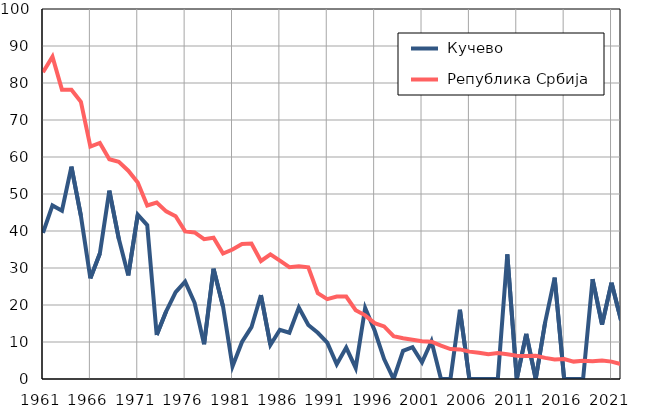
| Category |  Кучево |  Република Србија |
|---|---|---|
| 1961.0 | 39.5 | 82.9 |
| 1962.0 | 46.9 | 87.1 |
| 1963.0 | 45.5 | 78.2 |
| 1964.0 | 57.4 | 78.2 |
| 1965.0 | 44.1 | 74.9 |
| 1966.0 | 27.2 | 62.8 |
| 1967.0 | 33.9 | 63.8 |
| 1968.0 | 50.9 | 59.4 |
| 1969.0 | 37.9 | 58.7 |
| 1970.0 | 28 | 56.3 |
| 1971.0 | 44.4 | 53.1 |
| 1972.0 | 41.6 | 46.9 |
| 1973.0 | 11.9 | 47.7 |
| 1974.0 | 18.3 | 45.3 |
| 1975.0 | 23.5 | 44 |
| 1976.0 | 26.3 | 39.9 |
| 1977.0 | 20.6 | 39.6 |
| 1978.0 | 9.4 | 37.8 |
| 1979.0 | 29.8 | 38.2 |
| 1980.0 | 19.6 | 33.9 |
| 1981.0 | 3.4 | 35 |
| 1982.0 | 10 | 36.5 |
| 1983.0 | 14 | 36.6 |
| 1984.0 | 22.7 | 31.9 |
| 1985.0 | 9.2 | 33.7 |
| 1986.0 | 13.3 | 32 |
| 1987.0 | 12.5 | 30.2 |
| 1988.0 | 19.3 | 30.5 |
| 1989.0 | 14.6 | 30.2 |
| 1990.0 | 12.5 | 23.2 |
| 1991.0 | 9.8 | 21.6 |
| 1992.0 | 4 | 22.3 |
| 1993.0 | 8.5 | 22.3 |
| 1994.0 | 3 | 18.6 |
| 1995.0 | 19.2 | 17.2 |
| 1996.0 | 13.1 | 15.1 |
| 1997.0 | 5.4 | 14.2 |
| 1998.0 | 0 | 11.6 |
| 1999.0 | 7.6 | 11 |
| 2000.0 | 8.6 | 10.6 |
| 2001.0 | 4.5 | 10.2 |
| 2002.0 | 10.2 | 10.1 |
| 2003.0 | 0 | 9 |
| 2004.0 | 0 | 8.1 |
| 2005.0 | 18.7 | 8 |
| 2006.0 | 0 | 7.4 |
| 2007.0 | 0 | 7.1 |
| 2008.0 | 0 | 6.7 |
| 2009.0 | 0 | 7 |
| 2010.0 | 33.7 | 6.7 |
| 2011.0 | 0 | 6.3 |
| 2012.0 | 12.2 | 6.2 |
| 2013.0 | 0 | 6.3 |
| 2014.0 | 15.4 | 5.7 |
| 2015.0 | 27.4 | 5.3 |
| 2016.0 | 0 | 5.4 |
| 2017.0 | 0 | 4.7 |
| 2018.0 | 0 | 4.9 |
| 2019.0 | 27 | 4.8 |
| 2020.0 | 14.7 | 5 |
| 2021.0 | 26 | 4.7 |
| 2022.0 | 15.9 | 4 |